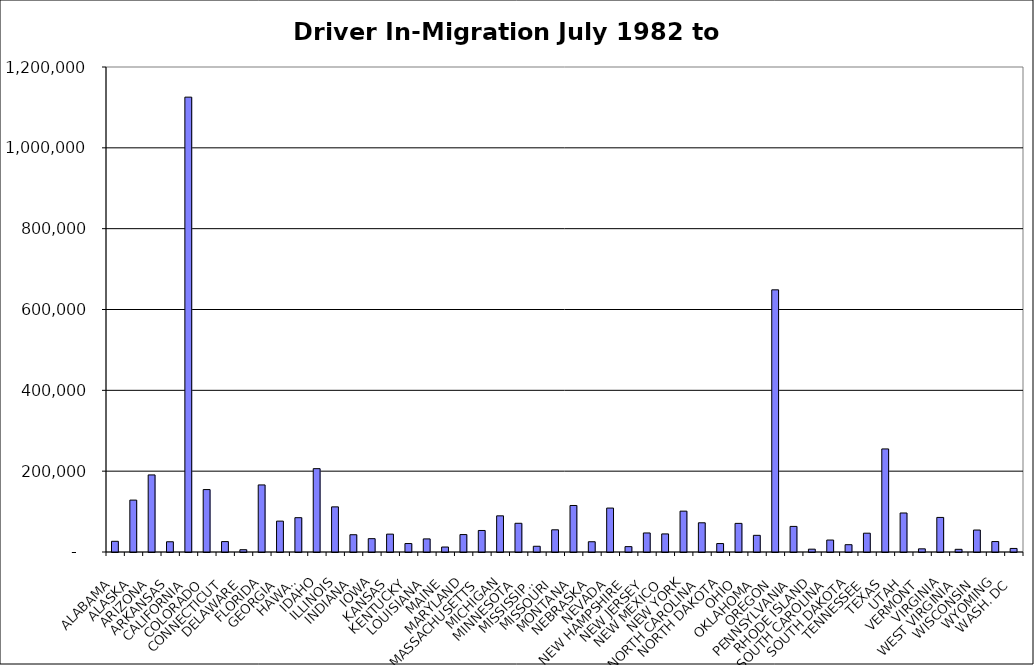
| Category | Series 0 |
|---|---|
| ALABAMA | 26465.5 |
| ALASKA | 128406.5 |
| ARIZONA | 190687 |
| ARKANSAS | 25359.5 |
| CALIFORNIA | 1125415.5 |
| COLORADO | 154474 |
| CONNECTICUT | 25779 |
| DELAWARE | 5660.5 |
| FLORIDA | 165932 |
| GEORGIA | 76395 |
| HAWAII | 84930.5 |
| IDAHO | 206192.5 |
| ILLINOIS | 111655.5 |
| INDIANA | 42727 |
| IOWA | 32987.5 |
| KANSAS | 44209.5 |
| KENTUCKY | 20946 |
| LOUISIANA | 32421.5 |
| MAINE | 12318.5 |
| MARYLAND | 43131 |
| MASSACHUSETTS | 53269 |
| MICHIGAN | 89465 |
| MINNESOTA | 71052.5 |
| MISSISSIPPI | 14150 |
| MISSOURI | 54906 |
| MONTANA | 115067 |
| NEBRASKA | 25381.5 |
| NEVADA | 108695 |
| NEW HAMPSHIRE | 13287.5 |
| NEW JERSEY | 47103 |
| NEW MEXICO | 44734 |
| NEW YORK | 101085 |
| NORTH CAROLINA | 72258.5 |
| NORTH DAKOTA | 20914.5 |
| OHIO | 70798.5 |
| OKLAHOMA | 41246 |
| OREGON | 648672 |
| PENNSYLVANIA | 63301.5 |
| RHODE ISLAND | 7016 |
| SOUTH CAROLINA | 29584.5 |
| SOUTH DAKOTA | 18076.5 |
| TENNESSEE | 46530.5 |
| TEXAS | 255001 |
| UTAH | 96495.5 |
| VERMONT | 7845 |
| VIRGINIA | 85519 |
| WEST VIRGINIA | 6633.5 |
| WISCONSIN | 54327.5 |
| WYOMING | 25849 |
| WASH. DC | 8806 |